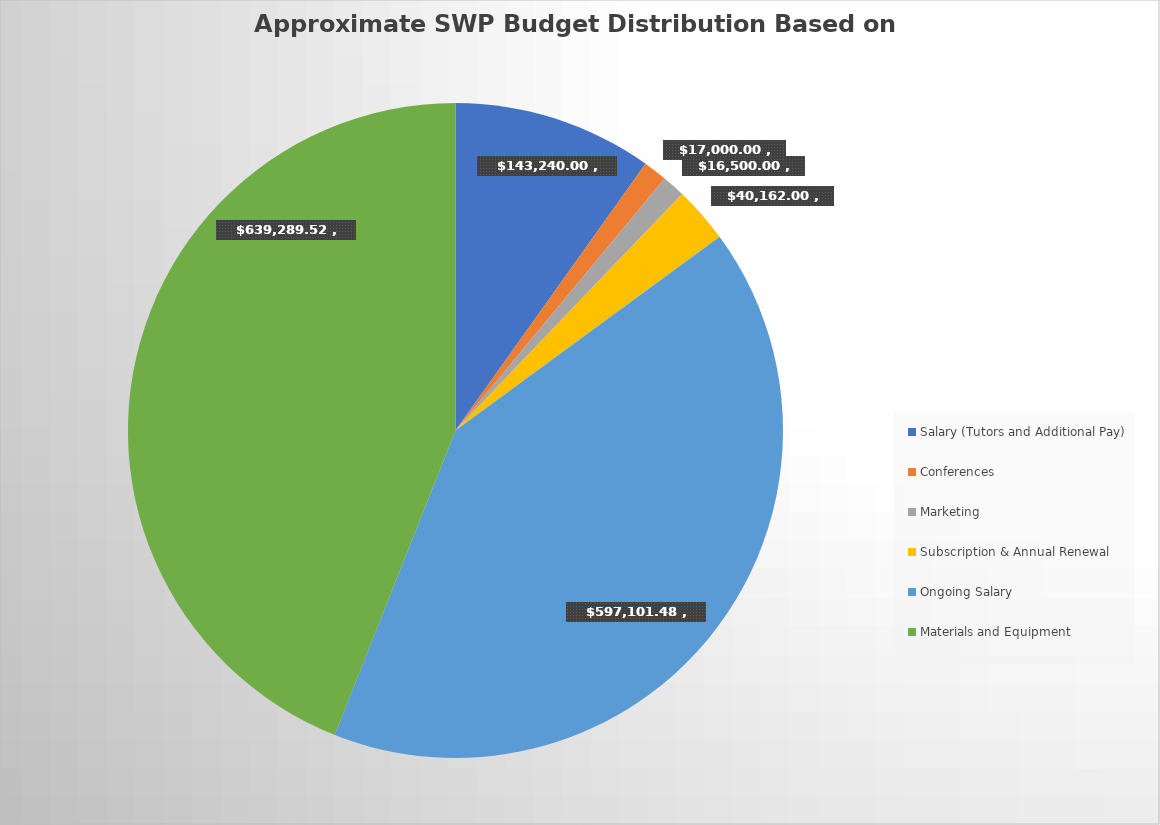
| Category | Approx. Payment | % to total  |
|---|---|---|
| Salary (Tutors and Additional Pay) | 143240 | 0.099 |
| Conferences | 17000 | 0.012 |
| Marketing | 16500 | 0.011 |
| Subscription & Annual Renewal | 40162 | 0.028 |
| Ongoing Salary | 597101.48 | 0.411 |
| Materials and Equipment | 639289.52 | 0.44 |